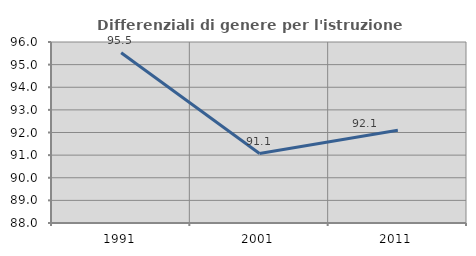
| Category | Differenziali di genere per l'istruzione superiore |
|---|---|
| 1991.0 | 95.523 |
| 2001.0 | 91.069 |
| 2011.0 | 92.099 |